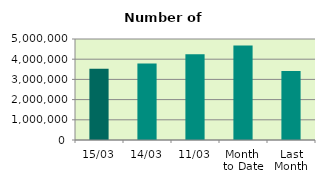
| Category | Series 0 |
|---|---|
| 15/03 | 3532970 |
| 14/03 | 3784668 |
| 11/03 | 4238976 |
| Month 
to Date | 4673063.091 |
| Last
Month | 3413232.3 |